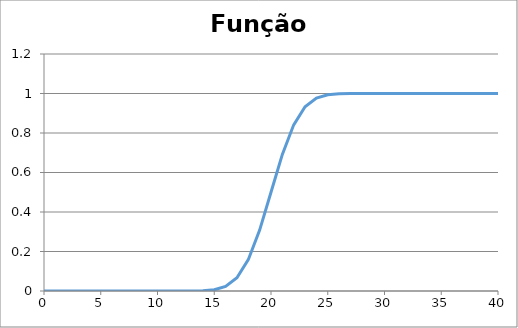
| Category | Series 0 |
|---|---|
| 0.0 | 0 |
| 1.0 | 0 |
| 2.0 | 0 |
| 3.0 | 0 |
| 4.0 | 0 |
| 5.0 | 0 |
| 6.0 | 0 |
| 7.0 | 0 |
| 8.0 | 0 |
| 9.0 | 0 |
| 10.0 | 0 |
| 11.0 | 0 |
| 12.0 | 0 |
| 13.0 | 0 |
| 14.0 | 0.001 |
| 15.0 | 0.006 |
| 16.0 | 0.023 |
| 17.0 | 0.067 |
| 18.0 | 0.159 |
| 19.0 | 0.309 |
| 20.0 | 0.5 |
| 21.0 | 0.691 |
| 22.0 | 0.841 |
| 23.0 | 0.933 |
| 24.0 | 0.977 |
| 25.0 | 0.994 |
| 26.0 | 0.999 |
| 27.0 | 1 |
| 28.0 | 1 |
| 29.0 | 1 |
| 30.0 | 1 |
| 31.0 | 1 |
| 32.0 | 1 |
| 33.0 | 1 |
| 34.0 | 1 |
| 35.0 | 1 |
| 36.0 | 1 |
| 37.0 | 1 |
| 38.0 | 1 |
| 39.0 | 1 |
| 40.0 | 1 |